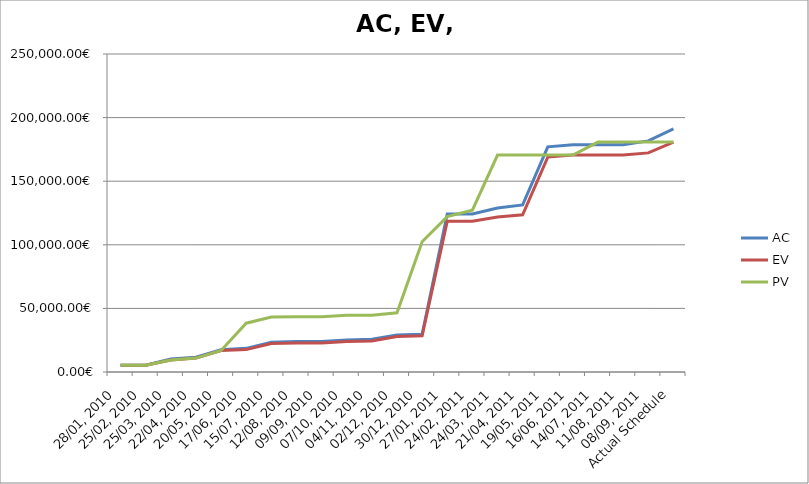
| Category | AC | EV | PV |
|---|---|---|---|
| 28/01, 2010 | 5262.4 | 5262.4 | 5262.4 |
| 25/02, 2010 | 5262.4 | 5262.4 | 5262.4 |
| 25/03, 2010 | 10155.84 | 9434.4 | 9434.4 |
| 22/04, 2010 | 11657.28 | 10935.84 | 10935.84 |
| 20/05, 2010 | 17592.96 | 16871.52 | 16871.52 |
| 17/06, 2010 | 18593.92 | 17622.24 | 38350.84 |
| 15/07, 2010 | 23426.56 | 22454.88 | 43183.48 |
| 12/08, 2010 | 23927.04 | 22705.12 | 43433.72 |
| 09/09, 2010 | 23927.04 | 22705.12 | 43433.72 |
| 07/10, 2010 | 25178.24 | 23956.32 | 44684.92 |
| 04/11, 2010 | 25678.72 | 24456.8 | 44684.92 |
| 02/12, 2010 | 29152.12 | 27930.2 | 46548.84 |
| 30/12, 2010 | 29652.6 | 28430.68 | 102422.84 |
| 27/01, 2011 | 124272.28 | 118516.6 | 122169.08 |
| 24/02, 2011 | 124272.28 | 118516.6 | 127255.16 |
| 24/03, 2011 | 128867.16 | 121850.68 | 170569.08 |
| 21/04, 2011 | 131385.56 | 123540.463 | 170569.08 |
| 19/05, 2011 | 176988.12 | 168964.28 | 170569.08 |
| 16/06, 2011 | 178592.92 | 170569.08 | 170569.08 |
| 14/07, 2011 | 178592.92 | 170569.08 | 180759.44 |
| 11/08, 2011 | 178592.92 | 170569.08 | 180759.44 |
| 08/09, 2011 | 181673.06 | 172251.28 | 180759.44 |
| Actual Schedule | 191065.06 | 180759.44 | 180759.44 |